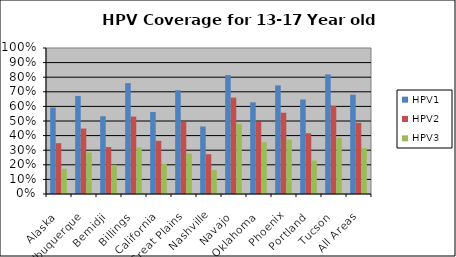
| Category | HPV1  | HPV2  | HPV3  |
|---|---|---|---|
| Alaska | 0.592 | 0.348 | 0.172 |
| Albuquerque | 0.672 | 0.448 | 0.284 |
| Bemidji | 0.532 | 0.321 | 0.2 |
| Billings | 0.759 | 0.53 | 0.318 |
| California | 0.562 | 0.364 | 0.206 |
| Great Plains | 0.711 | 0.495 | 0.277 |
| Nashville | 0.462 | 0.272 | 0.165 |
| Navajo | 0.814 | 0.66 | 0.48 |
| Oklahoma | 0.628 | 0.494 | 0.354 |
| Phoenix | 0.744 | 0.557 | 0.372 |
| Portland | 0.647 | 0.416 | 0.229 |
| Tucson | 0.819 | 0.605 | 0.385 |
| All Areas | 0.681 | 0.488 | 0.314 |